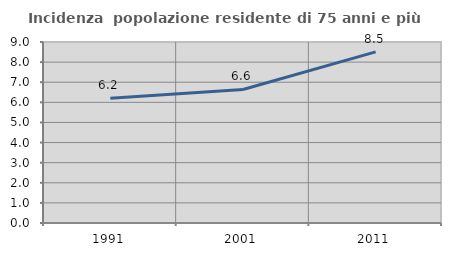
| Category | Incidenza  popolazione residente di 75 anni e più |
|---|---|
| 1991.0 | 6.198 |
| 2001.0 | 6.639 |
| 2011.0 | 8.51 |